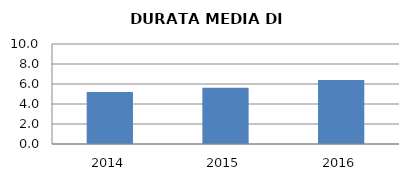
| Category | 2014 2015 2016 |
|---|---|
| 2014.0 | 5.2 |
| 2015.0 | 5.615 |
| 2016.0 | 6.4 |